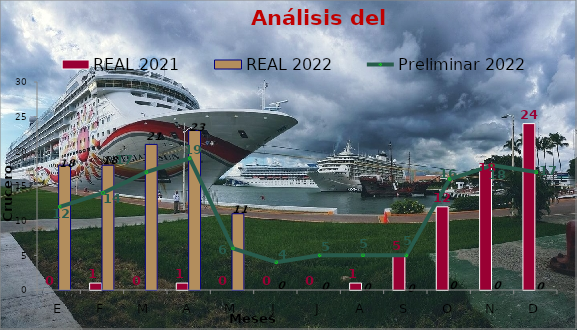
| Category | REAL 2021 | REAL 2022 |
|---|---|---|
| E | 0 | 18 |
| F | 1 | 18 |
| M | 0 | 21 |
| A | 1 | 23 |
| M | 0 | 11 |
| J | 0 | 0 |
| J | 0 | 0 |
| A | 1 | 0 |
| S | 5 | 0 |
| O | 12 | 0 |
| N | 18 | 0 |
| D | 24 | 0 |